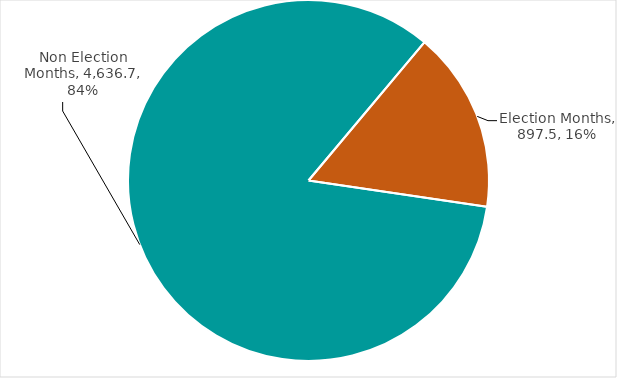
| Category | Total Grants |
|---|---|
| Election Months | 897.468 |
| Non Election Months | 4636.664 |